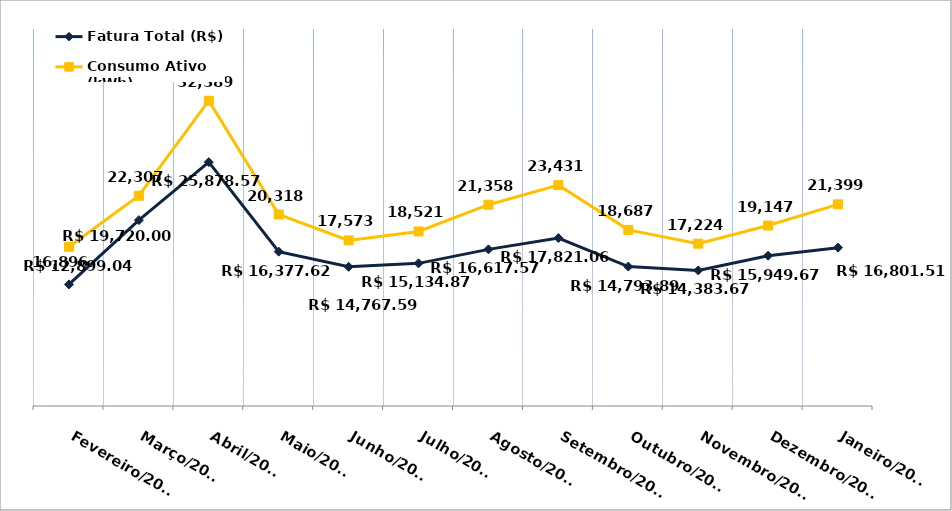
| Category | Fatura Total (R$) |
|---|---|
| Fevereiro/2023 | 12899.04 |
| Março/2023 | 19720 |
| Abril/2023 | 25878.57 |
| Maio/2023 | 16377.62 |
| Junho/2023 | 14767.59 |
| Julho/2023 | 15134.87 |
| Agosto/2023 | 16617.57 |
| Setembro/2023 | 17821.06 |
| Outubro/2023 | 14793.89 |
| Novembro/2023 | 14383.67 |
| Dezembro/2023 | 15949.67 |
| Janeiro/2024 | 16801.51 |